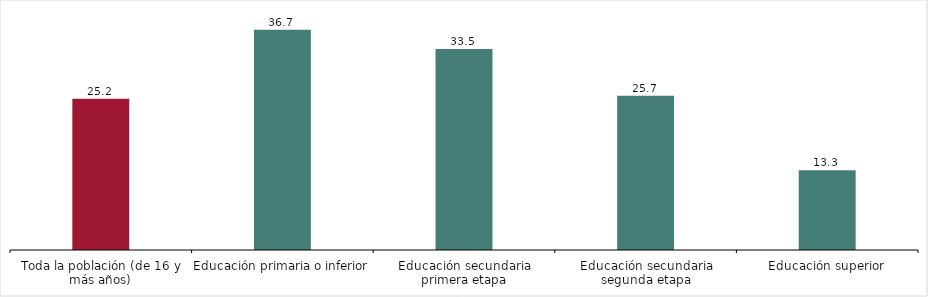
| Category | Nivel de formación alcanzado |
|---|---|
| Toda la población (de 16 y más años) | 25.2 |
| Educación primaria o inferior | 36.7 |
| Educación secundaria primera etapa | 33.5 |
| Educación secundaria segunda etapa | 25.7 |
| Educación superior | 13.3 |